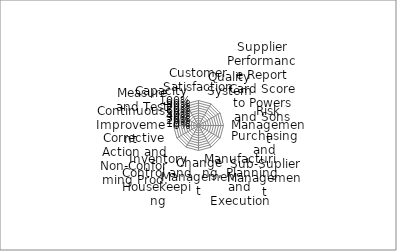
| Category | Series 0 |
|---|---|
| Customer Satisfaction | 0 |
| Quality System | 0 |
| Supplier Performance Report Card Score to Powers and Sons | 0 |
| Risk Management | 0 |
| Purchasing and Sub-Suplier Management | 0 |
| Manufacturing, Planning and Execution | 0 |
| Change Management | 0 |
| Inventory Control and Housekeeping | 0 |
| Corrective Action and Non-Conforming Prod. | 0 |
| Continuous Improvement | 0 |
| Measure and Test | 0 |
| Capacity | 0 |